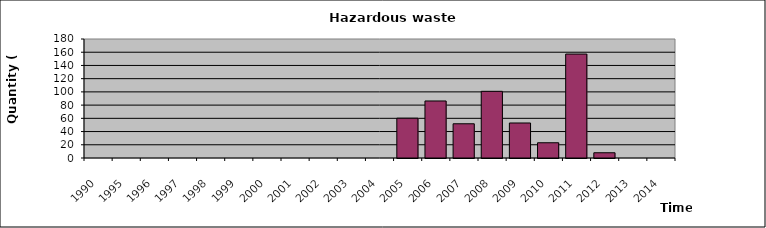
| Category | Series 1 |
|---|---|
| 1990.0 | 0 |
| 1995.0 | 0 |
| 1996.0 | 0 |
| 1997.0 | 0 |
| 1998.0 | 0 |
| 1999.0 | 0 |
| 2000.0 | 0 |
| 2001.0 | 0 |
| 2002.0 | 0 |
| 2003.0 | 0 |
| 2004.0 | 0 |
| 2005.0 | 60.2 |
| 2006.0 | 86.26 |
| 2007.0 | 51.76 |
| 2008.0 | 100.86 |
| 2009.0 | 52.96 |
| 2010.0 | 23.06 |
| 2011.0 | 157.22 |
| 2012.0 | 7.94 |
| 2013.0 | 0 |
| 2014.0 | 0 |